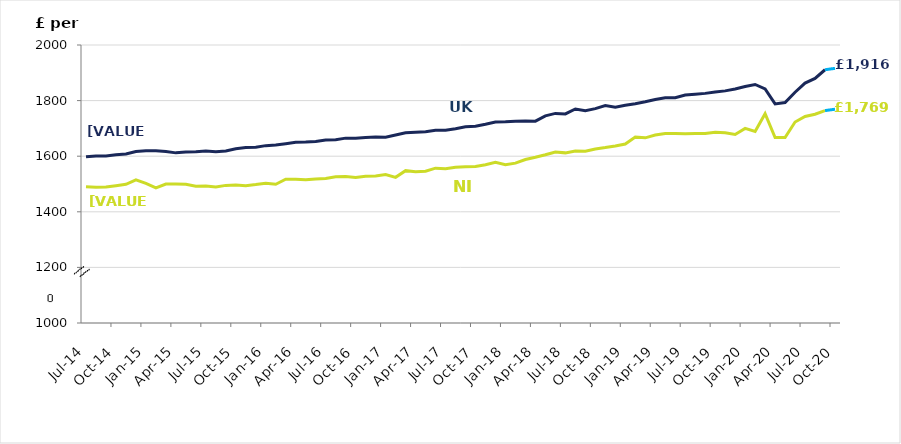
| Category | Series 0 | Series 1 |
|---|---|---|
| 2014-07-01 | 1490 | 1598 |
| 2014-08-01 | 1488 | 1601 |
| 2014-09-01 | 1489 | 1601 |
| 2014-10-01 | 1494 | 1605 |
| 2014-11-01 | 1499 | 1608 |
| 2014-12-01 | 1515 | 1617 |
| 2015-01-01 | 1502 | 1620 |
| 2015-02-01 | 1486 | 1620 |
| 2015-03-01 | 1500 | 1617 |
| 2015-04-01 | 1500 | 1612 |
| 2015-05-01 | 1499 | 1615 |
| 2015-06-01 | 1492 | 1616 |
| 2015-07-01 | 1493 | 1619 |
| 2015-08-01 | 1489 | 1616 |
| 2015-09-01 | 1495 | 1619 |
| 2015-10-01 | 1496 | 1627 |
| 2015-11-01 | 1494 | 1631 |
| 2015-12-01 | 1498 | 1632 |
| 2016-01-01 | 1503 | 1638 |
| 2016-02-01 | 1499 | 1640 |
| 2016-03-01 | 1517 | 1645 |
| 2016-04-01 | 1517 | 1650 |
| 2016-05-01 | 1515 | 1651 |
| 2016-06-01 | 1518 | 1653 |
| 2016-07-01 | 1520 | 1658 |
| 2016-08-01 | 1526 | 1659 |
| 2016-09-01 | 1527 | 1665 |
| 2016-10-01 | 1523 | 1665 |
| 2016-11-01 | 1528 | 1667 |
| 2016-12-01 | 1529 | 1669 |
| 2017-01-01 | 1534 | 1668 |
| 2017-02-01 | 1524 | 1676 |
| 2017-03-01 | 1548 | 1684 |
| 2017-04-01 | 1544 | 1686 |
| 2017-05-01 | 1546 | 1688 |
| 2017-06-01 | 1557 | 1693 |
| 2017-07-01 | 1555 | 1693 |
| 2017-08-01 | 1560 | 1699 |
| 2017-09-01 | 1562 | 1706 |
| 2017-10-01 | 1563 | 1708 |
| 2017-11-01 | 1569 | 1715 |
| 2017-12-01 | 1578 | 1723 |
| 2018-01-01 | 1569 | 1724 |
| 2018-02-01 | 1575 | 1726 |
| 2018-03-01 | 1588 | 1727 |
| 2018-04-01 | 1596 | 1726 |
| 2018-05-01 | 1605 | 1745 |
| 2018-06-01 | 1615 | 1754 |
| 2018-07-01 | 1612 | 1752 |
| 2018-08-01 | 1619 | 1770 |
| 2018-09-01 | 1618 | 1764 |
| 2018-10-01 | 1626 | 1771 |
| 2018-11-01 | 1631 | 1782 |
| 2018-12-01 | 1637 | 1776 |
| 2019-01-01 | 1644 | 1783 |
| 2019-02-01 | 1669 | 1789 |
| 2019-03-01 | 1666 | 1796 |
| 2019-04-01 | 1676 | 1804 |
| 2019-05-01 | 1682 | 1810 |
| 2019-06-01 | 1682 | 1810 |
| 2019-07-01 | 1681 | 1820 |
| 2019-08-01 | 1682 | 1823 |
| 2019-09-01 | 1682 | 1826 |
| 2019-10-01 | 1686 | 1831 |
| 2019-11-01 | 1684 | 1835 |
| 2019-12-01 | 1678 | 1842 |
| 2020-01-01 | 1700 | 1851 |
| 2020-02-01 | 1689 | 1858 |
| 2020-03-01 | 1753 | 1842 |
| 2020-04-01 | 1667 | 1788 |
| 2020-05-01 | 1667 | 1793 |
| 2020-06-01 | 1723 | 1830 |
| 2020-07-01 | 1743 | 1863 |
| 2020-08-01 | 1751 | 1880 |
| 2020-09-01 | 1764 | 1911 |
| 2020-10-01 | 1769 | 1916 |